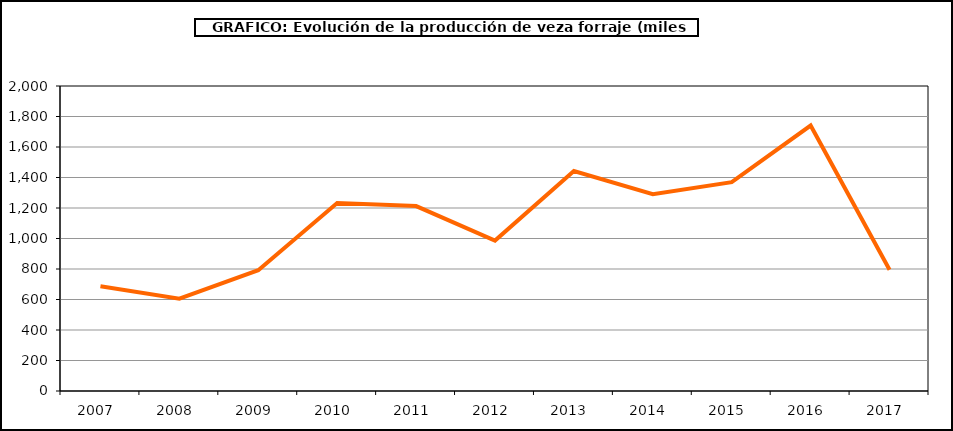
| Category | Producción |
|---|---|
| 2007.0 | 686.571 |
| 2008.0 | 605.65 |
| 2009.0 | 791.875 |
| 2010.0 | 1232.646 |
| 2011.0 | 1212.426 |
| 2012.0 | 986.263 |
| 2013.0 | 1442.069 |
| 2014.0 | 1290.565 |
| 2015.0 | 1369.532 |
| 2016.0 | 1740.854 |
| 2017.0 | 794.791 |